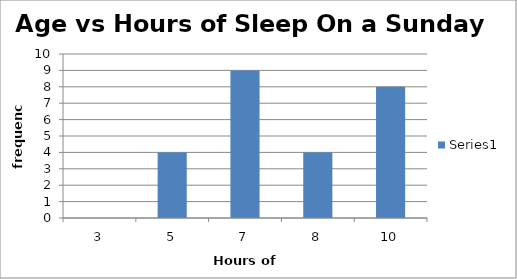
| Category | Series 0 |
|---|---|
| 3.0 | 0 |
| 5.0 | 4 |
| 7.0 | 9 |
| 8.0 | 4 |
| 10.0 | 8 |